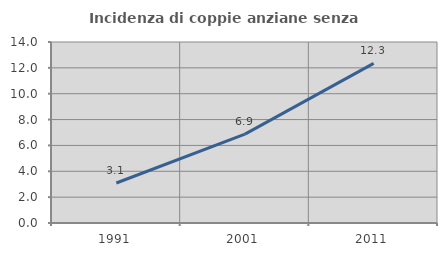
| Category | Incidenza di coppie anziane senza figli  |
|---|---|
| 1991.0 | 3.095 |
| 2001.0 | 6.871 |
| 2011.0 | 12.347 |